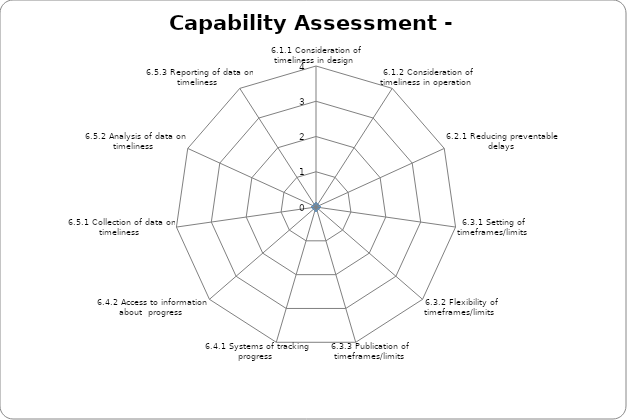
| Category | Series 0 |
|---|---|
| 6.1.1 Consideration of timeliness in design  | 0 |
| 6.1.2 Consideration of timeliness in operation  | 0 |
| 6.2.1 Reducing preventable delays  | 0 |
| 6.3.1 Setting of timeframes/limits | 0 |
| 6.3.2 Flexibility of timeframes/limits  | 0 |
| 6.3.3 Publication of timeframes/limits  | 0 |
| 6.4.1 Systems of tracking progress  | 0 |
| 6.4.2 Access to information about  progress  | 0 |
| 6.5.1 Collection of data on timeliness  | 0 |
| 6.5.2 Analysis of data on timeliness  | 0 |
| 6.5.3 Reporting of data on timeliness  | 0 |